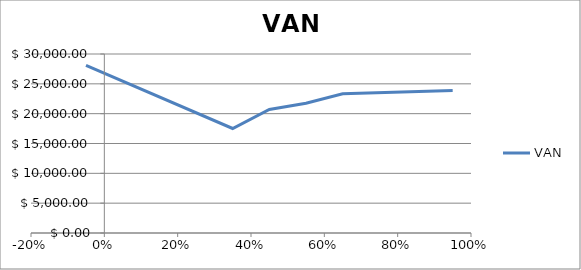
| Category | VAN |
|---|---|
| -0.05 | 28111.97 |
| 0.35 | 17515.87 |
| 0.45 | 20694.7 |
| 0.55 | 21754.31 |
| 0.65 | 23343.72 |
| 0.95 | 23873.53 |